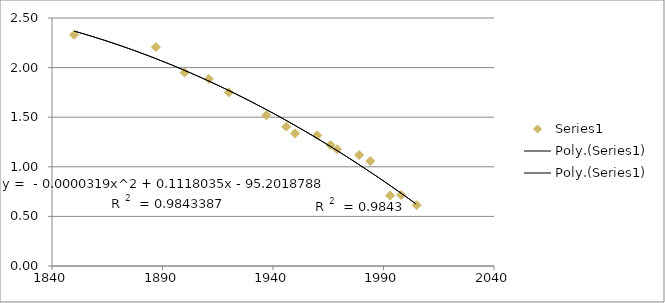
| Category | Series 0 |
|---|---|
| 1850.0 | 2.33 |
| 1887.0 | 2.207 |
| 1900.0 | 1.95 |
| 1911.0 | 1.886 |
| 1920.0 | 1.75 |
| 1937.0 | 1.519 |
| 1946.0 | 1.405 |
| 1950.0 | 1.337 |
| 1960.0 | 1.317 |
| 1966.0 | 1.219 |
| 1969.0 | 1.177 |
| 1979.0 | 1.119 |
| 1984.0 | 1.057 |
| 1993.0 | 0.71 |
| 1998.0 | 0.716 |
| 2005.0 | 0.613 |